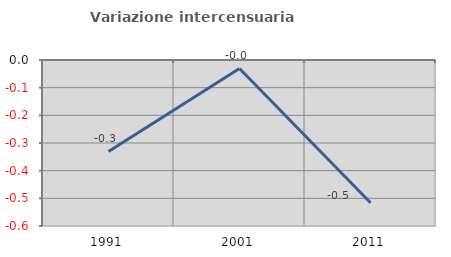
| Category | Variazione intercensuaria annua |
|---|---|
| 1991.0 | -0.331 |
| 2001.0 | -0.031 |
| 2011.0 | -0.516 |